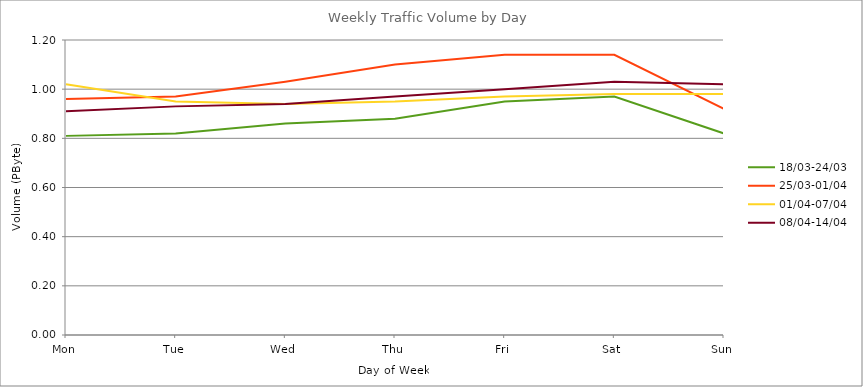
| Category | 18/03-24/03 | 25/03-01/04 | 01/04-07/04 | 08/04-14/04 |
|---|---|---|---|---|
| Mon | 0.81 | 0.96 | 1.02 | 0.91 |
| Tue | 0.82 | 0.97 | 0.95 | 0.93 |
| Wed | 0.86 | 1.03 | 0.94 | 0.94 |
| Thu | 0.88 | 1.1 | 0.95 | 0.97 |
| Fri | 0.95 | 1.14 | 0.97 | 1 |
| Sat | 0.97 | 1.14 | 0.98 | 1.03 |
| Sun | 0.82 | 0.92 | 0.98 | 1.02 |